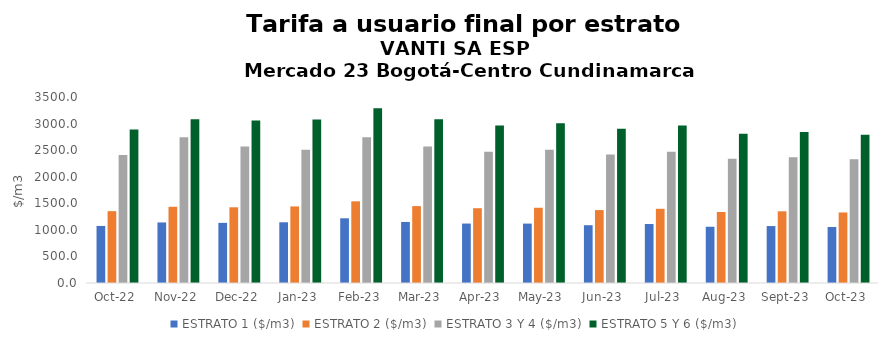
| Category | ESTRATO 1 ($/m3) | ESTRATO 2 ($/m3) | ESTRATO 3 Y 4 ($/m3) | ESTRATO 5 Y 6 ($/m3) |
|---|---|---|---|---|
| 2022-10-01 | 1073.46 | 1351.82 | 2408.2 | 2889.84 |
| 2022-11-01 | 1139.35 | 1434.14 | 2741.78 | 3081.132 |
| 2022-12-01 | 1131.49 | 1424.62 | 2567.53 | 3057.768 |
| 2023-01-01 | 1142.83 | 1440.88 | 2506.69 | 3074.928 |
| 2023-02-01 | 1217.5 | 1536.84 | 2741.78 | 3290.136 |
| 2023-03-01 | 1148.64 | 1447.09 | 2567.53 | 3081.036 |
| 2023-04-01 | 1118.47 | 1407.56 | 2468.54 | 2962.248 |
| 2023-05-01 | 1117.85 | 1415.65 | 2506.69 | 3008.028 |
| 2023-06-01 | 1087.36 | 1371.98 | 2417.38 | 2900.856 |
| 2023-07-01 | 1109.69 | 1396.46 | 2468.54 | 2962.248 |
| 2023-08-01 | 1058.46 | 1336.01 | 2339.09 | 2806.908 |
| 2023-09-01 | 1071.3 | 1349.34 | 2366.44 | 2839.728 |
| 2023-10-01 | 1054.11 | 1327.47 | 2326.42 | 2791.704 |